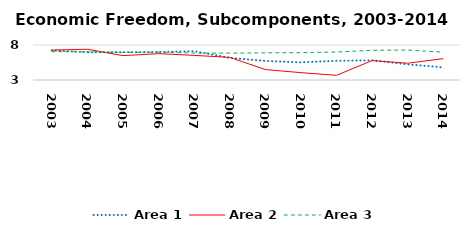
| Category | Area 1 | Area 2 | Area 3 |
|---|---|---|---|
| 2003.0 | 7.231 | 7.275 | 7.051 |
| 2004.0 | 6.968 | 7.395 | 7.039 |
| 2005.0 | 6.971 | 6.48 | 6.926 |
| 2006.0 | 6.991 | 6.764 | 6.977 |
| 2007.0 | 7.122 | 6.516 | 6.851 |
| 2008.0 | 6.16 | 6.234 | 6.835 |
| 2009.0 | 5.725 | 4.492 | 6.881 |
| 2010.0 | 5.52 | 4.048 | 6.91 |
| 2011.0 | 5.744 | 3.666 | 6.993 |
| 2012.0 | 5.813 | 5.776 | 7.244 |
| 2013.0 | 5.237 | 5.395 | 7.281 |
| 2014.0 | 4.801 | 6.046 | 6.974 |